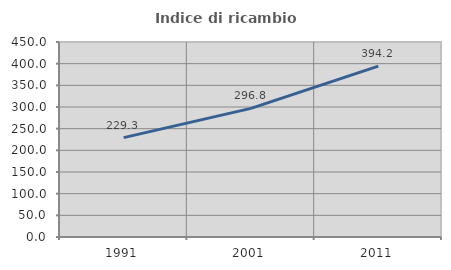
| Category | Indice di ricambio occupazionale  |
|---|---|
| 1991.0 | 229.278 |
| 2001.0 | 296.787 |
| 2011.0 | 394.248 |